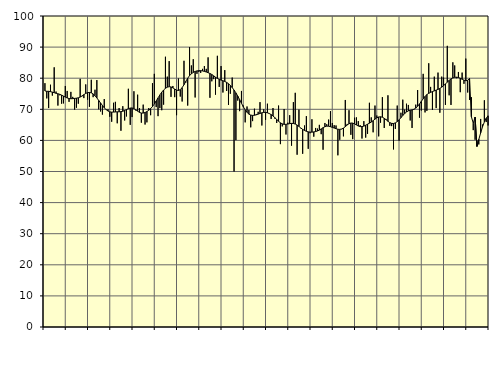
| Category | Piggar | Series 1 |
|---|---|---|
| nan | 78.4 | 75.92 |
| 1.0 | 73.5 | 75.78 |
| 1.0 | 70.4 | 75.79 |
| 1.0 | 77.9 | 75.67 |
| 1.0 | 74.4 | 75.53 |
| 1.0 | 83.5 | 75.34 |
| 1.0 | 75.7 | 75.15 |
| 1.0 | 71.2 | 74.99 |
| 1.0 | 74.5 | 74.82 |
| 1.0 | 71.8 | 74.55 |
| 1.0 | 71.9 | 74.24 |
| 1.0 | 77.5 | 73.92 |
| nan | 75.9 | 73.64 |
| 2.0 | 72.4 | 73.46 |
| 2.0 | 75.6 | 73.4 |
| 2.0 | 74 | 73.43 |
| 2.0 | 69.9 | 73.5 |
| 2.0 | 70.5 | 73.58 |
| 2.0 | 71.8 | 73.7 |
| 2.0 | 79.8 | 73.93 |
| 2.0 | 74.2 | 74.29 |
| 2.0 | 73.6 | 74.71 |
| 2.0 | 78 | 75.1 |
| 2.0 | 73.1 | 75.36 |
| nan | 70.8 | 75.42 |
| 3.0 | 79.5 | 75.29 |
| 3.0 | 73.9 | 74.93 |
| 3.0 | 76.3 | 74.36 |
| 3.0 | 79.4 | 73.65 |
| 3.0 | 70 | 72.86 |
| 3.0 | 69.3 | 72.05 |
| 3.0 | 68.3 | 71.24 |
| 3.0 | 73.3 | 70.49 |
| 3.0 | 69.8 | 69.89 |
| 3.0 | 70 | 69.45 |
| 3.0 | 67.6 | 69.17 |
| nan | 66 | 69.09 |
| 4.0 | 72.1 | 69.11 |
| 4.0 | 72.4 | 69.15 |
| 4.0 | 65.5 | 69.19 |
| 4.0 | 70.4 | 69.2 |
| 4.0 | 63.1 | 69.24 |
| 4.0 | 71 | 69.38 |
| 4.0 | 66.4 | 69.63 |
| 4.0 | 67.7 | 69.93 |
| 4.0 | 76.6 | 70.2 |
| 4.0 | 65 | 70.4 |
| 4.0 | 67.5 | 70.43 |
| nan | 75.8 | 70.24 |
| 5.0 | 69.6 | 69.86 |
| 5.0 | 74.7 | 69.4 |
| 5.0 | 70.4 | 69 |
| 5.0 | 65.7 | 68.79 |
| 5.0 | 71.5 | 68.79 |
| 5.0 | 65.1 | 68.96 |
| 5.0 | 65.8 | 69.27 |
| 5.0 | 70.4 | 69.69 |
| 5.0 | 68.1 | 70.22 |
| 5.0 | 78.4 | 70.89 |
| 5.0 | 81.4 | 71.72 |
| nan | 70.7 | 72.68 |
| 6.0 | 67.8 | 73.67 |
| 6.0 | 70.4 | 74.63 |
| 6.0 | 69.7 | 75.5 |
| 6.0 | 71.5 | 76.21 |
| 6.0 | 86.9 | 76.74 |
| 6.0 | 80.5 | 77.12 |
| 6.0 | 85.5 | 77.27 |
| 6.0 | 74 | 77.19 |
| 6.0 | 77.5 | 76.89 |
| 6.0 | 73.9 | 76.51 |
| 6.0 | 68.1 | 76.17 |
| nan | 79.9 | 76.06 |
| 7.0 | 74.1 | 76.32 |
| 7.0 | 72.5 | 76.97 |
| 7.0 | 85.6 | 77.9 |
| 7.0 | 78.6 | 78.99 |
| 7.0 | 71.2 | 80 |
| 7.0 | 90 | 80.82 |
| 7.0 | 84.1 | 81.44 |
| 7.0 | 86.1 | 81.86 |
| 7.0 | 73.8 | 82.17 |
| 7.0 | 81.4 | 82.35 |
| 7.0 | 82 | 82.44 |
| nan | 81.7 | 82.44 |
| 8.0 | 83 | 82.34 |
| 8.0 | 83.9 | 82.19 |
| 8.0 | 83 | 81.99 |
| 8.0 | 86.7 | 81.77 |
| 8.0 | 73.7 | 81.51 |
| 8.0 | 79 | 81.19 |
| 8.0 | 79.7 | 80.77 |
| 8.0 | 74.7 | 80.32 |
| 8.0 | 87.2 | 79.92 |
| 8.0 | 77.2 | 79.63 |
| 8.0 | 83.9 | 79.39 |
| nan | 75.4 | 79.18 |
| 9.0 | 82.6 | 78.95 |
| 9.0 | 75.9 | 78.65 |
| 9.0 | 71.4 | 78.22 |
| 9.0 | 75 | 77.66 |
| 9.0 | 80.2 | 76.98 |
| 9.0 | 50 | 76.19 |
| 9.0 | 60.1 | 75.28 |
| 9.0 | 72.8 | 74.26 |
| 9.0 | 69.4 | 73.13 |
| 9.0 | 75.9 | 71.94 |
| 9.0 | 71.2 | 70.81 |
| nan | 65.8 | 69.81 |
| 10.0 | 70.9 | 69.01 |
| 10.0 | 69.8 | 68.45 |
| 10.0 | 64.2 | 68.14 |
| 10.0 | 66.2 | 68.04 |
| 10.0 | 70.2 | 68.08 |
| 10.0 | 68.5 | 68.23 |
| 10.0 | 69.2 | 68.44 |
| 10.0 | 72.3 | 68.66 |
| 10.0 | 64.8 | 68.88 |
| 10.0 | 70 | 69.01 |
| 10.0 | 66.6 | 69.01 |
| nan | 71.8 | 68.88 |
| 11.0 | 68.7 | 68.63 |
| 11.0 | 66.9 | 68.29 |
| 11.0 | 70.4 | 67.86 |
| 11.0 | 67 | 67.32 |
| 11.0 | 65.6 | 66.74 |
| 11.0 | 71.2 | 66.16 |
| 11.0 | 58.8 | 65.66 |
| 11.0 | 64.5 | 65.32 |
| 11.0 | 70.1 | 65.16 |
| 11.0 | 61.9 | 65.16 |
| 11.0 | 65.7 | 65.26 |
| nan | 68.1 | 65.39 |
| 12.0 | 58.3 | 65.47 |
| 12.0 | 72.3 | 65.43 |
| 12.0 | 75.3 | 65.26 |
| 12.0 | 55.4 | 64.93 |
| 12.0 | 69.9 | 64.49 |
| 12.0 | 63.9 | 63.99 |
| 12.0 | 55.7 | 63.54 |
| 12.0 | 64.8 | 63.19 |
| 12.0 | 67.8 | 62.93 |
| 12.0 | 57.3 | 62.75 |
| 12.0 | 62.3 | 62.67 |
| nan | 66.8 | 62.66 |
| 13.0 | 61.2 | 62.73 |
| 13.0 | 64 | 62.85 |
| 13.0 | 63.8 | 63.03 |
| 13.0 | 65 | 63.31 |
| 13.0 | 62 | 63.7 |
| 13.0 | 57 | 64.09 |
| 13.0 | 65.6 | 64.4 |
| 13.0 | 65.2 | 64.58 |
| 13.0 | 66.7 | 64.56 |
| 13.0 | 69.4 | 64.4 |
| 13.0 | 65.6 | 64.19 |
| nan | 64.9 | 63.97 |
| 14.0 | 64.8 | 63.75 |
| 14.0 | 55.2 | 63.59 |
| 14.0 | 60.2 | 63.55 |
| 14.0 | 63.6 | 63.67 |
| 14.0 | 61.3 | 63.96 |
| 14.0 | 73 | 64.41 |
| 14.0 | 65.3 | 64.94 |
| 14.0 | 69.7 | 65.36 |
| 14.0 | 61.8 | 65.58 |
| 14.0 | 60.4 | 65.56 |
| 14.0 | 67.3 | 65.32 |
| nan | 67.4 | 64.96 |
| 15.0 | 66.2 | 64.62 |
| 15.0 | 64.9 | 64.44 |
| 15.0 | 60.6 | 64.43 |
| 15.0 | 66.2 | 64.6 |
| 15.0 | 60.9 | 64.88 |
| 15.0 | 62.1 | 65.21 |
| 15.0 | 72.1 | 65.54 |
| 15.0 | 67.4 | 65.9 |
| 15.0 | 62.6 | 66.34 |
| 15.0 | 71.2 | 66.84 |
| 15.0 | 68 | 67.26 |
| nan | 61.3 | 67.53 |
| 16.0 | 65.7 | 67.6 |
| 16.0 | 73.9 | 67.45 |
| 16.0 | 64 | 67.11 |
| 16.0 | 66.9 | 66.64 |
| 16.0 | 74.5 | 66.14 |
| 16.0 | 64.7 | 65.72 |
| 16.0 | 64.6 | 65.47 |
| 16.0 | 57.1 | 65.43 |
| 16.0 | 63.7 | 65.64 |
| 16.0 | 71.2 | 66.05 |
| 16.0 | 59.9 | 66.6 |
| nan | 68.9 | 67.29 |
| 17.0 | 73.1 | 68 |
| 17.0 | 69.9 | 68.63 |
| 17.0 | 71.8 | 69.14 |
| 17.0 | 71.4 | 69.5 |
| 17.0 | 66.4 | 69.68 |
| 17.0 | 64 | 69.81 |
| 17.0 | 69.9 | 70.01 |
| 17.0 | 71.5 | 70.39 |
| 17.0 | 76.2 | 70.96 |
| 17.0 | 67.3 | 71.71 |
| 17.0 | 69.6 | 72.54 |
| nan | 81.4 | 73.39 |
| 18.0 | 69 | 74.16 |
| 18.0 | 69.5 | 74.73 |
| 18.0 | 84.8 | 75.13 |
| 18.0 | 77.2 | 75.44 |
| 18.0 | 69.8 | 75.7 |
| 18.0 | 80.5 | 75.93 |
| 18.0 | 70.4 | 76.17 |
| 18.0 | 81.8 | 76.41 |
| 18.0 | 68.9 | 76.71 |
| 18.0 | 80.5 | 77.1 |
| 18.0 | 80.2 | 77.62 |
| nan | 71.4 | 78.17 |
| 19.0 | 90.4 | 78.72 |
| 19.0 | 74.5 | 79.3 |
| 19.0 | 71.4 | 79.78 |
| 19.0 | 85.1 | 80.09 |
| 19.0 | 84.1 | 80.28 |
| 19.0 | 80 | 80.33 |
| 19.0 | 82 | 80.22 |
| 19.0 | 75.5 | 79.98 |
| 19.0 | 81.8 | 79.67 |
| 19.0 | 78.2 | 79.37 |
| 19.0 | 86.3 | 79.19 |
| nan | 75.4 | 79.32 |
| 20.0 | 73 | 79.88 |
| 20.0 | 73.9 | 67.62 |
| 20.0 | 63.3 | 65.54 |
| 20.0 | 60.2 | 67.49 |
| 20.0 | 60 | 58.07 |
| 20.0 | 58.7 | 60.29 |
| 20.0 | 66.9 | 62.43 |
| 20.0 | 65.1 | 64.35 |
| 20.0 | 72.9 | 65.94 |
| 20.0 | 65.9 | 67.13 |
| 20.0 | 64.8 | 67.93 |